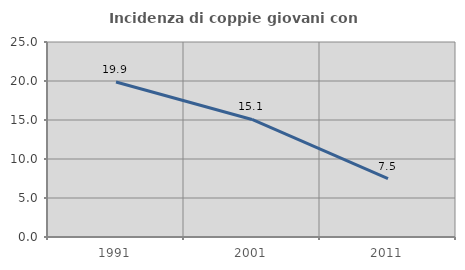
| Category | Incidenza di coppie giovani con figli |
|---|---|
| 1991.0 | 19.863 |
| 2001.0 | 15.068 |
| 2011.0 | 7.483 |